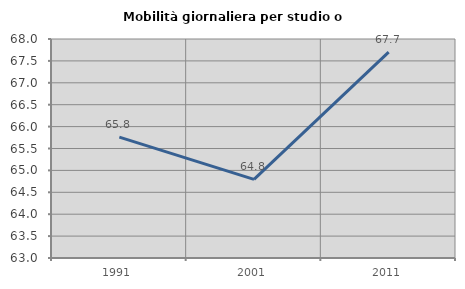
| Category | Mobilità giornaliera per studio o lavoro |
|---|---|
| 1991.0 | 65.76 |
| 2001.0 | 64.796 |
| 2011.0 | 67.7 |